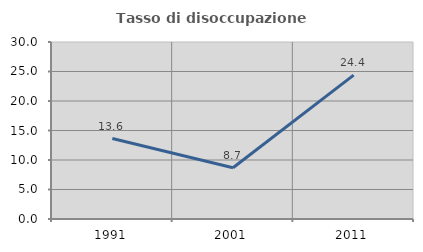
| Category | Tasso di disoccupazione giovanile  |
|---|---|
| 1991.0 | 13.636 |
| 2001.0 | 8.696 |
| 2011.0 | 24.39 |